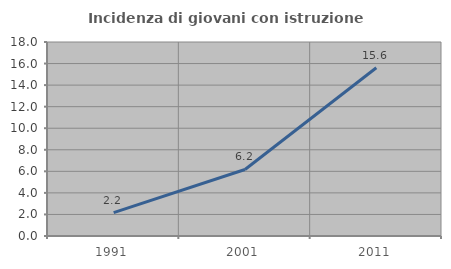
| Category | Incidenza di giovani con istruzione universitaria |
|---|---|
| 1991.0 | 2.171 |
| 2001.0 | 6.172 |
| 2011.0 | 15.609 |